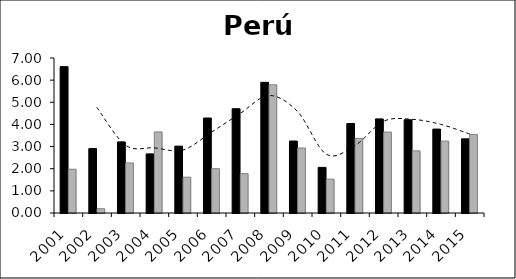
| Category | Series 0 | Series 1 |
|---|---|---|
| 2001.0 | 6.61 | 1.976 |
| 2002.0 | 2.91 | 0.192 |
| 2003.0 | 3.21 | 2.26 |
| 2004.0 | 2.67 | 3.662 |
| 2005.0 | 3.02 | 1.618 |
| 2006.0 | 4.29 | 2.001 |
| 2007.0 | 4.71 | 1.778 |
| 2008.0 | 5.9 | 5.789 |
| 2009.0 | 3.25 | 2.935 |
| 2010.0 | 2.06 | 1.53 |
| 2011.0 | 4.04 | 3.37 |
| 2012.0 | 4.25 | 3.655 |
| 2013.0 | 4.21 | 2.806 |
| 2014.0 | 3.79 | 3.246 |
| 2015.0 | 3.35 | 3.548 |